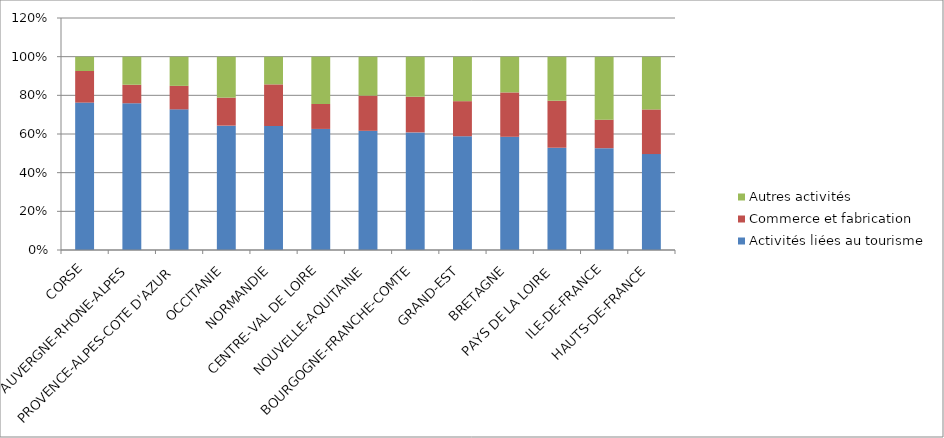
| Category | Activités liées au tourisme | Commerce et fabrication | Autres activités |
|---|---|---|---|
| CORSE | 0.762 | 0.163 | 0.074 |
| AUVERGNE-RHONE-ALPES | 0.759 | 0.096 | 0.145 |
| PROVENCE-ALPES-COTE D'AZUR | 0.727 | 0.122 | 0.151 |
| OCCITANIE | 0.643 | 0.145 | 0.212 |
| NORMANDIE | 0.641 | 0.215 | 0.143 |
| CENTRE-VAL DE LOIRE | 0.626 | 0.129 | 0.245 |
| NOUVELLE-AQUITAINE | 0.616 | 0.182 | 0.202 |
| BOURGOGNE-FRANCHE-COMTE | 0.608 | 0.184 | 0.207 |
| GRAND-EST | 0.588 | 0.181 | 0.23 |
| BRETAGNE | 0.586 | 0.229 | 0.185 |
| PAYS DE LA LOIRE | 0.529 | 0.243 | 0.228 |
| ILE-DE-FRANCE | 0.527 | 0.148 | 0.326 |
| HAUTS-DE-FRANCE | 0.496 | 0.231 | 0.273 |